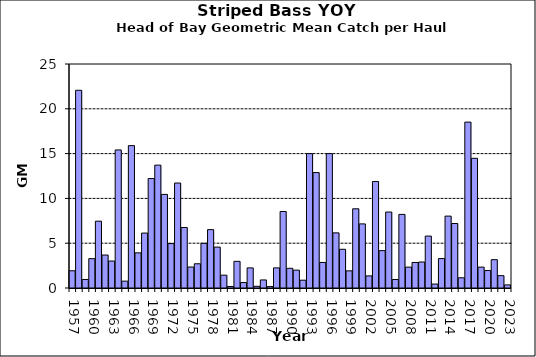
| Category | Series 0 |
|---|---|
| 1957.0 | 1.922 |
| 1958.0 | 22.066 |
| 1959.0 | 0.954 |
| 1960.0 | 3.276 |
| 1961.0 | 7.458 |
| 1962.0 | 3.679 |
| 1963.0 | 3.01 |
| 1964.0 | 15.407 |
| 1965.0 | 0.765 |
| 1966.0 | 15.89 |
| 1967.0 | 3.921 |
| 1968.0 | 6.131 |
| 1969.0 | 12.215 |
| 1970.0 | 13.713 |
| 1971.0 | 10.447 |
| 1972.0 | 4.955 |
| 1973.0 | 11.714 |
| 1974.0 | 6.751 |
| 1975.0 | 2.339 |
| 1976.0 | 2.704 |
| 1977.0 | 4.986 |
| 1978.0 | 6.513 |
| 1979.0 | 4.564 |
| 1980.0 | 1.431 |
| 1981.0 | 0.171 |
| 1982.0 | 2.977 |
| 1983.0 | 0.606 |
| 1984.0 | 2.244 |
| 1985.0 | 0.191 |
| 1986.0 | 0.898 |
| 1987.0 | 0.155 |
| 1988.0 | 2.247 |
| 1989.0 | 8.537 |
| 1990.0 | 2.198 |
| 1991.0 | 1.995 |
| 1992.0 | 0.872 |
| 1993.0 | 14.998 |
| 1994.0 | 12.88 |
| 1995.0 | 2.85 |
| 1996.0 | 15 |
| 1997.0 | 6.153 |
| 1998.0 | 4.321 |
| 1999.0 | 1.914 |
| 2000.0 | 8.841 |
| 2001.0 | 7.153 |
| 2002.0 | 1.351 |
| 2003.0 | 11.888 |
| 2004.0 | 4.17 |
| 2005.0 | 8.479 |
| 2006.0 | 0.947 |
| 2007.0 | 8.215 |
| 2008.0 | 2.331 |
| 2009.0 | 2.848 |
| 2010.0 | 2.902 |
| 2011.0 | 5.795 |
| 2012.0 | 0.437 |
| 2013.0 | 3.288 |
| 2014.0 | 8.023 |
| 2015.0 | 7.198 |
| 2016.0 | 1.14 |
| 2017.0 | 18.516 |
| 2018.0 | 14.477 |
| 2019.0 | 2.329 |
| 2020.0 | 1.95 |
| 2021.0 | 3.163 |
| 2022.0 | 1.378 |
| 2023.0 | 0.344 |